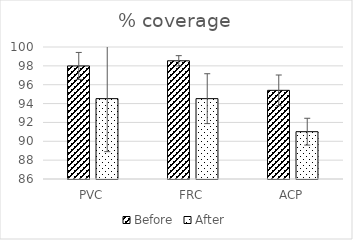
| Category | Before | After |
|---|---|---|
| PVC | 97.991 | 94.522 |
| FRC | 98.535 | 94.522 |
| ACP | 95.404 | 91.019 |